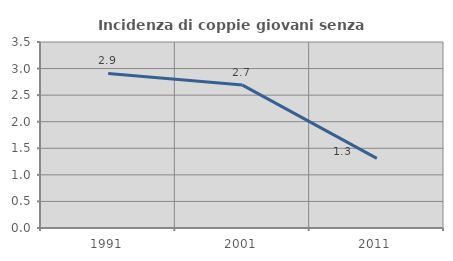
| Category | Incidenza di coppie giovani senza figli |
|---|---|
| 1991.0 | 2.908 |
| 2001.0 | 2.689 |
| 2011.0 | 1.309 |